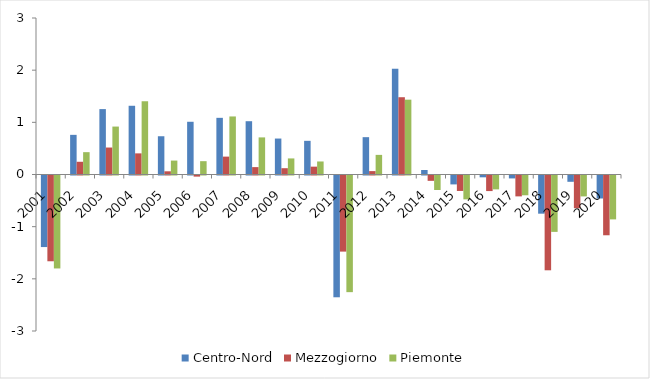
| Category | Centro-Nord | Mezzogiorno | Piemonte |
|---|---|---|---|
| 2001 | -1.372 | -1.644 | -1.782 |
| 2002 | 0.76 | 0.244 | 0.428 |
| 2003 | 1.254 | 0.517 | 0.919 |
| 2004 | 1.318 | 0.405 | 1.404 |
| 2005 | 0.733 | 0.061 | 0.267 |
| 2006 | 1.011 | -0.021 | 0.256 |
| 2007 | 1.086 | 0.343 | 1.113 |
| 2008 | 1.022 | 0.142 | 0.711 |
| 2009 | 0.689 | 0.121 | 0.308 |
| 2010 | 0.645 | 0.151 | 0.25 |
| 2011 | -2.334 | -1.459 | -2.236 |
| 2012 | 0.716 | 0.065 | 0.376 |
| 2013 | 2.027 | 1.481 | 1.435 |
| 2014 | 0.086 | -0.102 | -0.278 |
| 2015 | -0.171 | -0.297 | -0.457 |
| 2016 | -0.035 | -0.299 | -0.266 |
| 2017 | -0.056 | -0.4 | -0.379 |
| 2018 | -0.732 | -1.817 | -1.081 |
| 2019 | -0.121 | -0.627 | -0.401 |
| 2020 | -0.441 | -1.146 | -0.841 |